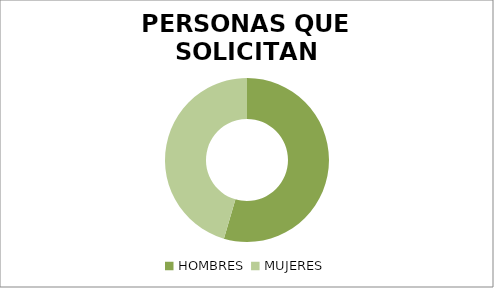
| Category | PERSONAS QUE SOLICITAN INFORMACION  |
|---|---|
| HOMBRES  | 18 |
| MUJERES | 15 |